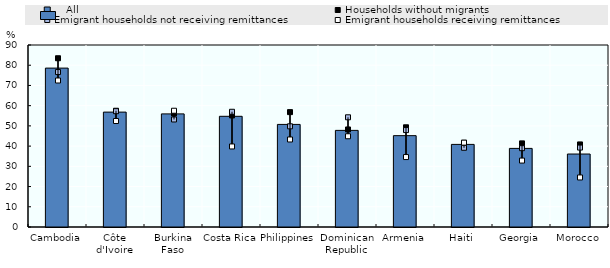
| Category |     All |
|---|---|
| Cambodia | 78.58 |
| Côte d'Ivoire | 56.82 |
| Burkina Faso | 55.94 |
| Costa Rica | 54.74 |
| Philippines | 50.73 |
| Dominican Republic | 47.78 |
| Armenia | 45.17 |
| Haiti | 40.85 |
| Georgia | 38.87 |
| Morocco | 36.09 |